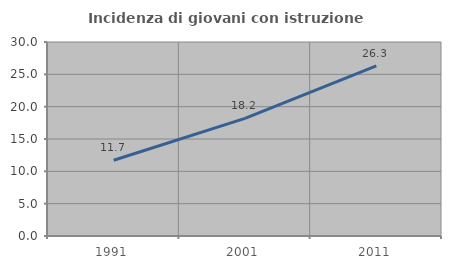
| Category | Incidenza di giovani con istruzione universitaria |
|---|---|
| 1991.0 | 11.721 |
| 2001.0 | 18.182 |
| 2011.0 | 26.303 |